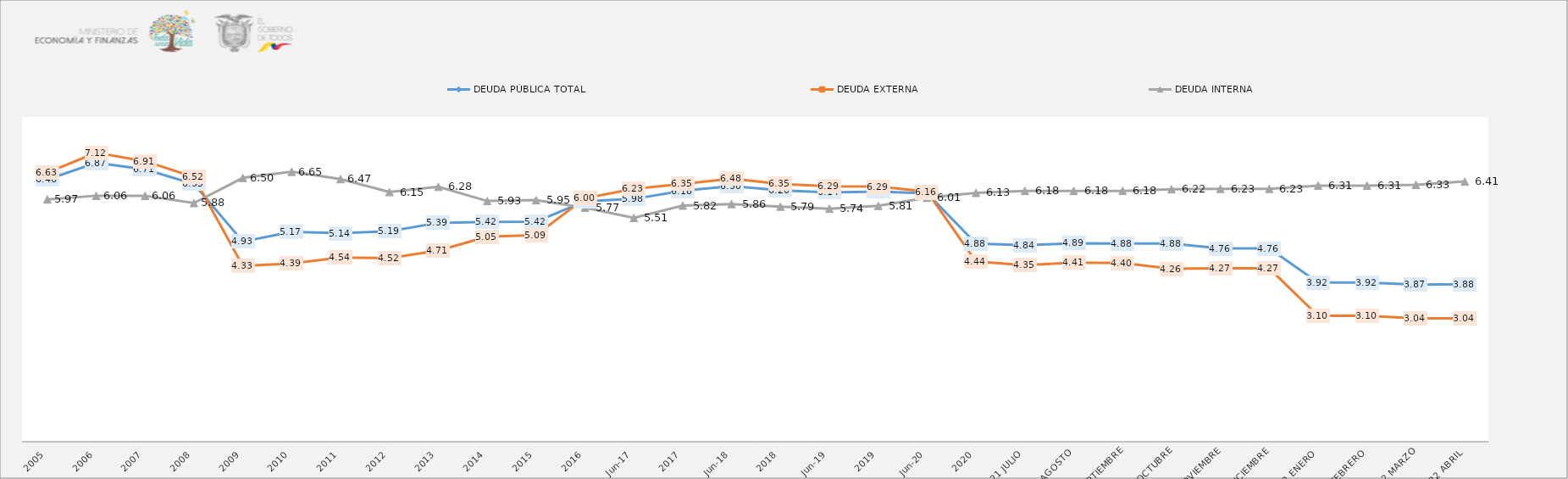
| Category | DEUDA PÚBLICA TOTAL | DEUDA EXTERNA  | DEUDA INTERNA |
|---|---|---|---|
| 2005 | 6.46 | 6.63 | 5.97 |
| 2006 | 6.87 | 7.12 | 6.06 |
| 2007 | 6.71 | 6.91 | 6.06 |
| 2008 | 6.35 | 6.52 | 5.88 |
| 2009 | 4.93 | 4.33 | 6.5 |
| 2010 | 5.17 | 4.39 | 6.65 |
| 2011 | 5.137 | 4.54 | 6.47 |
| 2012 | 5.186 | 4.521 | 6.15 |
| 2013 | 5.391 | 4.709 | 6.28 |
| 2014 | 5.416 | 5.048 | 5.93 |
| 2015 | 5.421 | 5.092 | 5.952 |
| 2016 | 5.922 | 5.998 | 5.767 |
| jun-17 | 5.982 | 6.228 | 5.513 |
| 2017 | 6.181 | 6.35 | 5.817 |
| jun-18 | 6.297 | 6.479 | 5.855 |
| 2018 | 6.195 | 6.35 | 5.792 |
| jun-19 | 6.143 | 6.29 | 5.74 |
| 2019 | 6.164 | 6.285 | 5.811 |
| jun-20 | 6.121 | 6.161 | 6.012 |
| 2020 | 4.881 | 4.437 | 6.132 |
| 2021 JULIO | 4.84 | 4.351 | 6.18 |
| 2021 AGOSTO | 4.89 | 4.41 | 6.18 |
| 2021 SEPTIEMBRE | 4.88 | 4.4 | 6.18 |
| 2021 OCTUBRE | 4.88 | 4.26 | 6.22 |
| 2021 NOVIEMBRE | 4.76 | 4.27 | 6.23 |
| 2021 DICIEMBRE | 4.76 | 4.27 | 6.23 |
| 2022 ENERO | 3.92 | 3.1 | 6.31 |
| 2022 FEBRERO | 3.92 | 3.1 | 6.31 |
| 2022 MARZO | 3.87 | 3.04 | 6.33 |
| 2022 ABRIL | 3.88 | 3.04 | 6.41 |